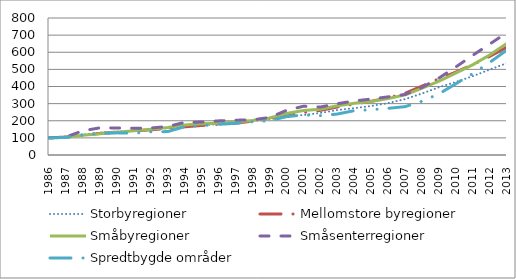
| Category | Storbyregioner | Mellomstore byregioner | Småbyregioner | Småsenterregioner | Spredtbygde områder |
|---|---|---|---|---|---|
| 1986.0 | 100 | 100 | 100 | 100 | 100 |
| 1987.0 | 107.282 | 105.023 | 103.653 | 105.574 | 102.547 |
| 1988.0 | 118.901 | 114.876 | 115.91 | 141.44 | 118.549 |
| 1989.0 | 130.518 | 125.824 | 124.495 | 158.619 | 125.305 |
| 1990.0 | 136.55 | 134.122 | 132.923 | 158.242 | 129.291 |
| 1991.0 | 141.62 | 140.17 | 141.186 | 155.802 | 127.796 |
| 1992.0 | 148.495 | 146.808 | 149.907 | 157.429 | 135.216 |
| 1993.0 | 156.507 | 154.874 | 160.406 | 166.534 | 136.766 |
| 1994.0 | 164.908 | 164.551 | 175.125 | 190.518 | 165.393 |
| 1995.0 | 172.893 | 172.572 | 182.235 | 192.343 | 171.705 |
| 1996.0 | 180.618 | 179.382 | 185.418 | 199.345 | 178.959 |
| 1997.0 | 187.641 | 185.854 | 192.851 | 203.214 | 185.05 |
| 1998.0 | 197.923 | 197.792 | 201.231 | 205.178 | 194.131 |
| 1999.0 | 210.417 | 211.899 | 215.92 | 219.143 | 199.668 |
| 2000.0 | 223.918 | 233.016 | 242.426 | 260.385 | 224.031 |
| 2001.0 | 233.76 | 248.51 | 260.162 | 284.745 | 233.887 |
| 2002.0 | 245.503 | 260.539 | 267.731 | 280.123 | 229.9 |
| 2003.0 | 262.521 | 280.571 | 287.479 | 299.524 | 239.147 |
| 2004.0 | 273.57 | 298.048 | 301.592 | 315.572 | 259.136 |
| 2005.0 | 286.093 | 313.784 | 312.511 | 326.88 | 264.618 |
| 2006.0 | 303.298 | 334.006 | 330.335 | 339.655 | 272.536 |
| 2007.0 | 326.493 | 360.658 | 350.855 | 353.739 | 282.447 |
| 2008.0 | 359.369 | 402.678 | 390.985 | 394.981 | 314.396 |
| 2009.0 | 396.212 | 445.502 | 432.005 | 449.931 | 357.697 |
| 2010.0 | 426.777 | 484.485 | 479.871 | 515.176 | 416.833 |
| 2011.0 | 461.018 | 528.593 | 528.02 | 583.198 | 476.301 |
| 2012.0 | 499.735 | 576.967 | 585.389 | 649.157 | 541.916 |
| 2013.0 | 536.721 | 629.889 | 652.368 | 715.275 | 613.455 |